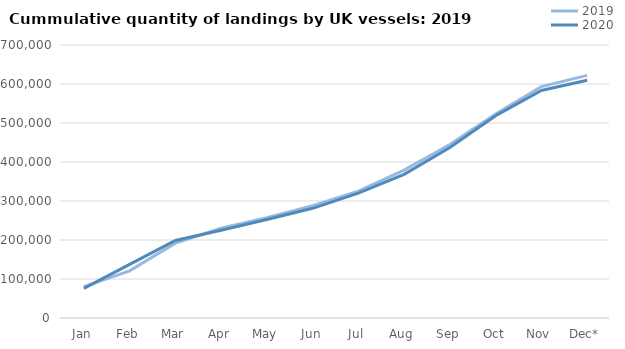
| Category | 2019 | 2020 |
|---|---|---|
| Jan | 80449.291 | 76070.432 |
| Feb | 121010.956 | 137469.636 |
| Mar | 191950.174 | 198850.507 |
| Apr | 229953.665 | 225030.118 |
| May | 257093.368 | 252514.053 |
| Jun | 287897.579 | 281245.868 |
| Jul | 325295.935 | 320301.207 |
| Aug | 379258.977 | 368159.711 |
| Sep | 445010.558 | 436951.487 |
| Oct | 522875.566 | 518812.345 |
| Nov | 593385.793 | 583438.742 |
| Dec* | 622141.763 | 609728.192 |